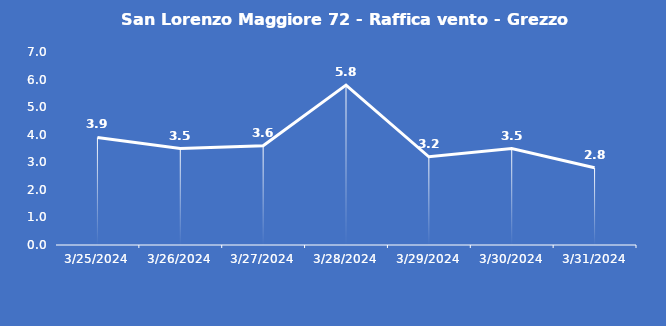
| Category | San Lorenzo Maggiore 72 - Raffica vento - Grezzo (m/s) |
|---|---|
| 3/25/24 | 3.9 |
| 3/26/24 | 3.5 |
| 3/27/24 | 3.6 |
| 3/28/24 | 5.8 |
| 3/29/24 | 3.2 |
| 3/30/24 | 3.5 |
| 3/31/24 | 2.8 |